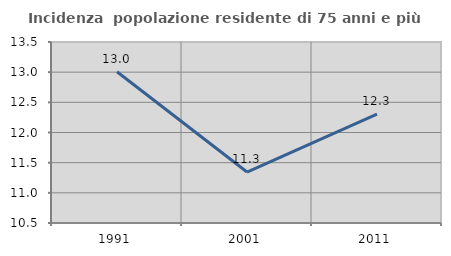
| Category | Incidenza  popolazione residente di 75 anni e più |
|---|---|
| 1991.0 | 13.006 |
| 2001.0 | 11.345 |
| 2011.0 | 12.305 |